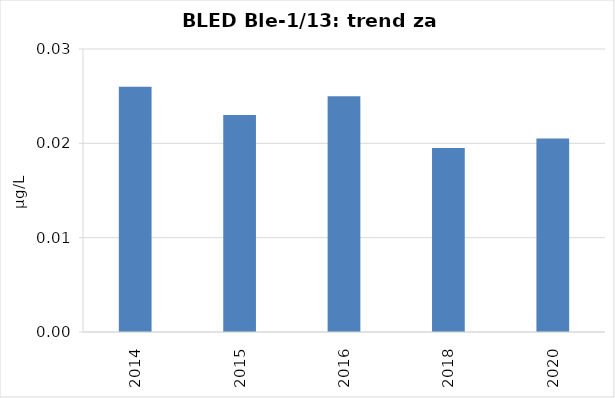
| Category | Vsota |
|---|---|
| 2014 | 0.026 |
| 2015 | 0.023 |
| 2016 | 0.025 |
| 2018 | 0.02 |
| 2020 | 0.02 |